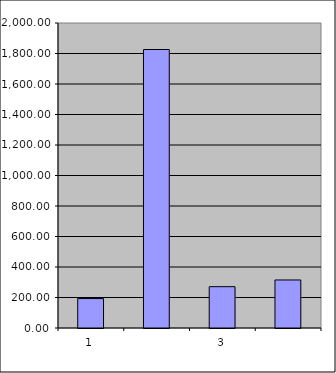
| Category | Series 0 |
|---|---|
| 0 | 193 |
| 1 | 1826.203 |
| 2 | 270.998 |
| 3 | 314.944 |